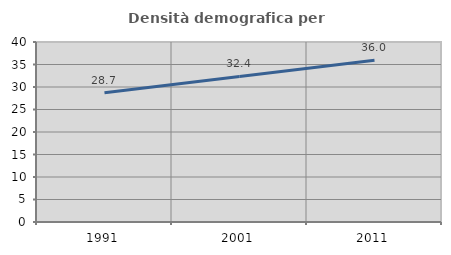
| Category | Densità demografica |
|---|---|
| 1991.0 | 28.699 |
| 2001.0 | 32.353 |
| 2011.0 | 35.954 |